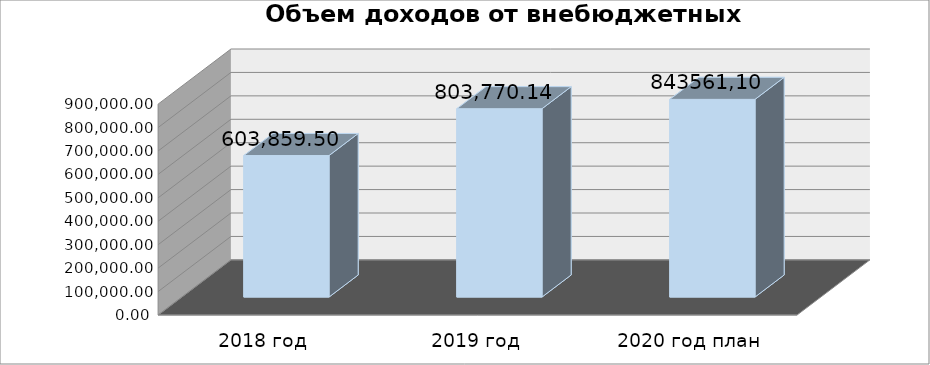
| Category | Series 0 |
|---|---|
| 2018 год | 603859.5 |
| 2019 год | 803770.14 |
| 2020 год план | 843561.1 |